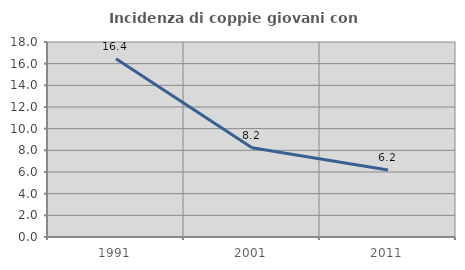
| Category | Incidenza di coppie giovani con figli |
|---|---|
| 1991.0 | 16.444 |
| 2001.0 | 8.243 |
| 2011.0 | 6.186 |